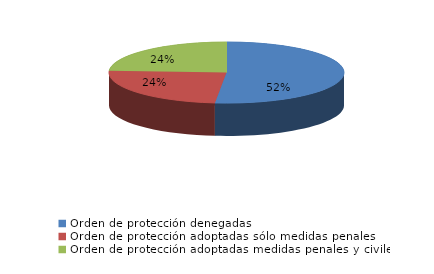
| Category | Series 0 |
|---|---|
| Orden de protección denegadas | 2433 |
| Orden de protección adoptadas sólo medidas penales | 1148 |
| Orden de protección adoptadas medidas penales y civiles | 1137 |